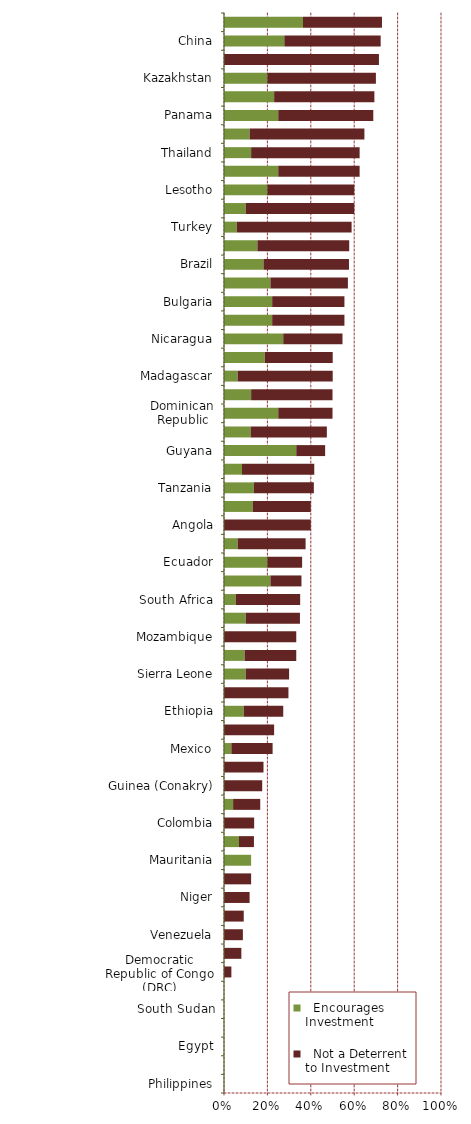
| Category |   Encourages Investment |   Not a Deterrent to Investment |
|---|---|---|
| Philippines | 0 | 0 |
| Central African Republic | 0 | 0 |
| Egypt | 0 | 0 |
| Nigeria | 0 | 0 |
| South Sudan | 0 | 0 |
| Sudan | 0 | 0 |
| Democratic Republic of Congo (DRC) | 0 | 0.034 |
| Papua New Guinea | 0 | 0.08 |
| Venezuela | 0 | 0.087 |
| Honduras | 0 | 0.091 |
| Niger | 0 | 0.118 |
| Solomon Islands | 0 | 0.125 |
| Mauritania | 0.125 | 0 |
| Mali | 0.069 | 0.069 |
| Colombia | 0 | 0.139 |
| Zimbabwe | 0.042 | 0.125 |
| Guinea (Conakry) | 0 | 0.176 |
| Guatemala | 0 | 0.182 |
| Mexico | 0.034 | 0.19 |
| Kenya | 0 | 0.231 |
| Ethiopia | 0.091 | 0.182 |
| Indonesia | 0 | 0.297 |
| Sierra Leone | 0.1 | 0.2 |
| Ivory Coast | 0.095 | 0.238 |
| Mozambique | 0 | 0.333 |
| Bolivia | 0.1 | 0.25 |
| South Africa | 0.054 | 0.297 |
| Russia | 0.214 | 0.143 |
| Ecuador | 0.2 | 0.16 |
| Eritrea | 0.063 | 0.313 |
| Angola | 0 | 0.4 |
| Kyrgyzstan | 0.133 | 0.267 |
| Tanzania | 0.138 | 0.276 |
| Myanmar | 0.083 | 0.333 |
| Guyana | 0.333 | 0.133 |
| Peru | 0.123 | 0.351 |
| Dominican Republic | 0.25 | 0.25 |
| Mongolia | 0.125 | 0.375 |
| Madagascar | 0.063 | 0.438 |
| Uganda | 0.188 | 0.313 |
| Nicaragua | 0.273 | 0.273 |
| Cambodia | 0.222 | 0.333 |
| Bulgaria | 0.222 | 0.333 |
| Ghana | 0.214 | 0.357 |
| Brazil | 0.182 | 0.394 |
| Burkina Faso | 0.154 | 0.423 |
| Turkey | 0.059 | 0.529 |
| Laos | 0.1 | 0.5 |
| Lesotho | 0.2 | 0.4 |
| French Guiana | 0.25 | 0.375 |
| Thailand | 0.125 | 0.5 |
| Mendoza | 0.118 | 0.529 |
| Panama | 0.25 | 0.438 |
| Jujuy | 0.231 | 0.462 |
| Kazakhstan | 0.2 | 0.5 |
| Liberia | 0 | 0.714 |
| China | 0.278 | 0.444 |
| Romania | 0.364 | 0.364 |